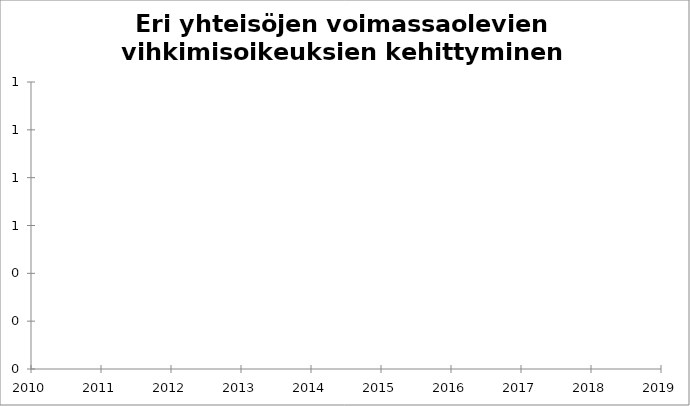
| Category | Series 0 |
|---|---|
| 2010 | 556 |
| 2011 | 567 |
| 2012 | 599 |
| 2013 | 623 |
| 2014 | 643 |
| 2015 | 674 |
| 2016 | 713 |
| 2017 | 746 |
| 2018 | 801 |
| 2019 | 818 |